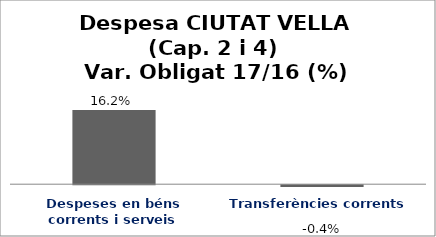
| Category | Series 0 |
|---|---|
| Despeses en béns corrents i serveis | 0.162 |
| Transferències corrents | -0.004 |